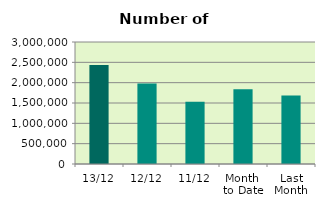
| Category | Series 0 |
|---|---|
| 13/12 | 2435756 |
| 12/12 | 1977146 |
| 11/12 | 1528952 |
| Month 
to Date | 1837565.8 |
| Last
Month | 1681386.857 |